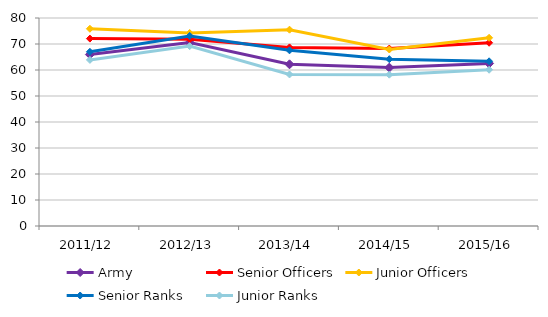
| Category | Army | Senior Officers | Junior Officers | Senior Ranks | Junior Ranks |
|---|---|---|---|---|---|
| 2011/12 | 65.946 | 72.079 | 75.859 | 66.994 | 63.887 |
| 2012/13 | 70.549 | 71.789 | 74.225 | 73.11 | 69.18 |
| 2013/14 | 62.189 | 68.691 | 75.506 | 67.563 | 58.289 |
| 2014/15 | 60.923 | 68.244 | 67.891 | 64.164 | 58.206 |
| 2015/16 | 62.519 | 70.478 | 72.378 | 63.341 | 60.105 |